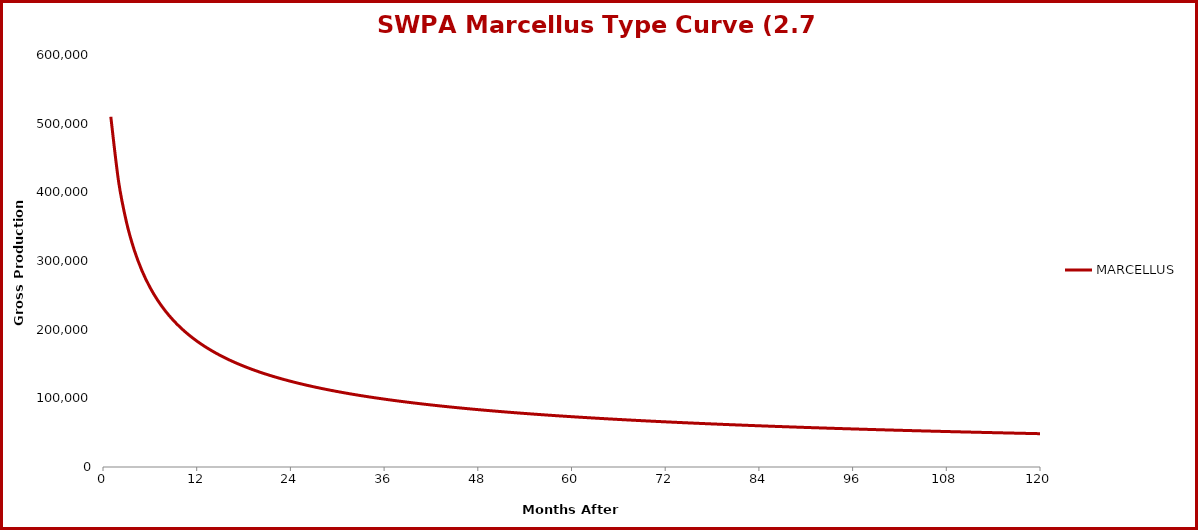
| Category | MARCELLUS |
|---|---|
| 1.0 | 510050 |
| 2.0 | 415552 |
| 3.0 | 356814 |
| 4.0 | 315990 |
| 5.0 | 285609 |
| 6.0 | 261923 |
| 7.0 | 242824 |
| 8.0 | 227023 |
| 9.0 | 213686 |
| 10.0 | 202243 |
| 11.0 | 192294 |
| 12.0 | 183544 |
| 13.0 | 175777 |
| 14.0 | 168824 |
| 15.0 | 162556 |
| 16.0 | 156869 |
| 17.0 | 151681 |
| 18.0 | 146924 |
| 19.0 | 142543 |
| 20.0 | 138492 |
| 21.0 | 134733 |
| 22.0 | 131232 |
| 23.0 | 127963 |
| 24.0 | 124901 |
| 25.0 | 122025 |
| 26.0 | 119319 |
| 27.0 | 116766 |
| 28.0 | 114353 |
| 29.0 | 112068 |
| 30.0 | 109900 |
| 31.0 | 107840 |
| 32.0 | 105879 |
| 33.0 | 104010 |
| 34.0 | 102226 |
| 35.0 | 100520 |
| 36.0 | 98888 |
| 37.0 | 97325 |
| 38.0 | 95825 |
| 39.0 | 94385 |
| 40.0 | 93001 |
| 41.0 | 91669 |
| 42.0 | 90387 |
| 43.0 | 89151 |
| 44.0 | 87959 |
| 45.0 | 86809 |
| 46.0 | 85697 |
| 47.0 | 84623 |
| 48.0 | 83583 |
| 49.0 | 82577 |
| 50.0 | 81602 |
| 51.0 | 80657 |
| 52.0 | 79740 |
| 53.0 | 78850 |
| 54.0 | 77987 |
| 55.0 | 77148 |
| 56.0 | 76332 |
| 57.0 | 75539 |
| 58.0 | 74767 |
| 59.0 | 74016 |
| 60.0 | 73285 |
| 61.0 | 72572 |
| 62.0 | 71878 |
| 63.0 | 71201 |
| 64.0 | 70540 |
| 65.0 | 69896 |
| 66.0 | 69267 |
| 67.0 | 68652 |
| 68.0 | 68052 |
| 69.0 | 67466 |
| 70.0 | 66893 |
| 71.0 | 66332 |
| 72.0 | 65784 |
| 73.0 | 65248 |
| 74.0 | 64723 |
| 75.0 | 64209 |
| 76.0 | 63705 |
| 77.0 | 63213 |
| 78.0 | 62730 |
| 79.0 | 62256 |
| 80.0 | 61793 |
| 81.0 | 61338 |
| 82.0 | 60892 |
| 83.0 | 60454 |
| 84.0 | 60025 |
| 85.0 | 59603 |
| 86.0 | 59190 |
| 87.0 | 58783 |
| 88.0 | 58385 |
| 89.0 | 57993 |
| 90.0 | 57608 |
| 91.0 | 57230 |
| 92.0 | 56858 |
| 93.0 | 56493 |
| 94.0 | 56134 |
| 95.0 | 55781 |
| 96.0 | 55433 |
| 97.0 | 55092 |
| 98.0 | 54756 |
| 99.0 | 54425 |
| 100.0 | 54099 |
| 101.0 | 53779 |
| 102.0 | 53464 |
| 103.0 | 53153 |
| 104.0 | 52847 |
| 105.0 | 52546 |
| 106.0 | 52249 |
| 107.0 | 51957 |
| 108.0 | 51669 |
| 109.0 | 51385 |
| 110.0 | 51105 |
| 111.0 | 50830 |
| 112.0 | 50558 |
| 113.0 | 50290 |
| 114.0 | 50026 |
| 115.0 | 49765 |
| 116.0 | 49508 |
| 117.0 | 49254 |
| 118.0 | 49004 |
| 119.0 | 48757 |
| 120.0 | 48514 |
| 121.0 | 48274 |
| 122.0 | 48036 |
| 123.0 | 47802 |
| 124.0 | 47571 |
| 125.0 | 47343 |
| 126.0 | 47117 |
| 127.0 | 46895 |
| 128.0 | 46675 |
| 129.0 | 46458 |
| 130.0 | 46244 |
| 131.0 | 46032 |
| 132.0 | 45823 |
| 133.0 | 45616 |
| 134.0 | 45412 |
| 135.0 | 45210 |
| 136.0 | 45010 |
| 137.0 | 44813 |
| 138.0 | 44618 |
| 139.0 | 44426 |
| 140.0 | 44235 |
| 141.0 | 44046 |
| 142.0 | 43858 |
| 143.0 | 43671 |
| 144.0 | 43485 |
| 145.0 | 43300 |
| 146.0 | 43115 |
| 147.0 | 42931 |
| 148.0 | 42748 |
| 149.0 | 42566 |
| 150.0 | 42384 |
| 151.0 | 42203 |
| 152.0 | 42023 |
| 153.0 | 41844 |
| 154.0 | 41665 |
| 155.0 | 41488 |
| 156.0 | 41311 |
| 157.0 | 41135 |
| 158.0 | 40959 |
| 159.0 | 40784 |
| 160.0 | 40610 |
| 161.0 | 40437 |
| 162.0 | 40265 |
| 163.0 | 40093 |
| 164.0 | 39922 |
| 165.0 | 39752 |
| 166.0 | 39582 |
| 167.0 | 39413 |
| 168.0 | 39245 |
| 169.0 | 39078 |
| 170.0 | 38911 |
| 171.0 | 38745 |
| 172.0 | 38580 |
| 173.0 | 38415 |
| 174.0 | 38252 |
| 175.0 | 38088 |
| 176.0 | 37926 |
| 177.0 | 37764 |
| 178.0 | 37603 |
| 179.0 | 37443 |
| 180.0 | 37283 |
| 181.0 | 37124 |
| 182.0 | 36966 |
| 183.0 | 36808 |
| 184.0 | 36651 |
| 185.0 | 36495 |
| 186.0 | 36339 |
| 187.0 | 36184 |
| 188.0 | 36030 |
| 189.0 | 35876 |
| 190.0 | 35723 |
| 191.0 | 35571 |
| 192.0 | 35419 |
| 193.0 | 35268 |
| 194.0 | 35117 |
| 195.0 | 34968 |
| 196.0 | 34818 |
| 197.0 | 34670 |
| 198.0 | 34522 |
| 199.0 | 34375 |
| 200.0 | 34228 |
| 201.0 | 34082 |
| 202.0 | 33937 |
| 203.0 | 33792 |
| 204.0 | 33648 |
| 205.0 | 33504 |
| 206.0 | 33361 |
| 207.0 | 33219 |
| 208.0 | 33077 |
| 209.0 | 32936 |
| 210.0 | 32796 |
| 211.0 | 32656 |
| 212.0 | 32517 |
| 213.0 | 32378 |
| 214.0 | 32240 |
| 215.0 | 32102 |
| 216.0 | 31966 |
| 217.0 | 31829 |
| 218.0 | 31693 |
| 219.0 | 31558 |
| 220.0 | 31424 |
| 221.0 | 31290 |
| 222.0 | 31156 |
| 223.0 | 31023 |
| 224.0 | 30891 |
| 225.0 | 30759 |
| 226.0 | 30628 |
| 227.0 | 30497 |
| 228.0 | 30367 |
| 229.0 | 30238 |
| 230.0 | 30109 |
| 231.0 | 29980 |
| 232.0 | 29852 |
| 233.0 | 29725 |
| 234.0 | 29598 |
| 235.0 | 29472 |
| 236.0 | 29346 |
| 237.0 | 29221 |
| 238.0 | 29097 |
| 239.0 | 28972 |
| 240.0 | 28849 |
| 241.0 | 28726 |
| 242.0 | 28603 |
| 243.0 | 28481 |
| 244.0 | 28360 |
| 245.0 | 28239 |
| 246.0 | 28118 |
| 247.0 | 27998 |
| 248.0 | 27879 |
| 249.0 | 27760 |
| 250.0 | 27642 |
| 251.0 | 27524 |
| 252.0 | 27406 |
| 253.0 | 27290 |
| 254.0 | 27173 |
| 255.0 | 27057 |
| 256.0 | 26942 |
| 257.0 | 26827 |
| 258.0 | 26712 |
| 259.0 | 26599 |
| 260.0 | 26485 |
| 261.0 | 26372 |
| 262.0 | 26260 |
| 263.0 | 26148 |
| 264.0 | 26036 |
| 265.0 | 25925 |
| 266.0 | 25814 |
| 267.0 | 25704 |
| 268.0 | 25595 |
| 269.0 | 25486 |
| 270.0 | 25377 |
| 271.0 | 25269 |
| 272.0 | 25161 |
| 273.0 | 25054 |
| 274.0 | 24947 |
| 275.0 | 24840 |
| 276.0 | 24734 |
| 277.0 | 24629 |
| 278.0 | 24524 |
| 279.0 | 24419 |
| 280.0 | 24315 |
| 281.0 | 24211 |
| 282.0 | 24108 |
| 283.0 | 24005 |
| 284.0 | 23903 |
| 285.0 | 23801 |
| 286.0 | 23699 |
| 287.0 | 23598 |
| 288.0 | 23498 |
| 289.0 | 23397 |
| 290.0 | 23298 |
| 291.0 | 23198 |
| 292.0 | 23099 |
| 293.0 | 23001 |
| 294.0 | 22903 |
| 295.0 | 22805 |
| 296.0 | 22708 |
| 297.0 | 22611 |
| 298.0 | 22514 |
| 299.0 | 22418 |
| 300.0 | 22323 |
| 301.0 | 22228 |
| 302.0 | 22133 |
| 303.0 | 22038 |
| 304.0 | 21944 |
| 305.0 | 21851 |
| 306.0 | 21757 |
| 307.0 | 21665 |
| 308.0 | 21572 |
| 309.0 | 21480 |
| 310.0 | 21389 |
| 311.0 | 21297 |
| 312.0 | 21207 |
| 313.0 | 21116 |
| 314.0 | 21026 |
| 315.0 | 20936 |
| 316.0 | 20847 |
| 317.0 | 20758 |
| 318.0 | 20670 |
| 319.0 | 20581 |
| 320.0 | 20494 |
| 321.0 | 20406 |
| 322.0 | 20319 |
| 323.0 | 20233 |
| 324.0 | 20146 |
| 325.0 | 20060 |
| 326.0 | 19975 |
| 327.0 | 19890 |
| 328.0 | 19805 |
| 329.0 | 19720 |
| 330.0 | 19636 |
| 331.0 | 19552 |
| 332.0 | 19469 |
| 333.0 | 19386 |
| 334.0 | 19303 |
| 335.0 | 19221 |
| 336.0 | 19139 |
| 337.0 | 19057 |
| 338.0 | 18976 |
| 339.0 | 18895 |
| 340.0 | 18814 |
| 341.0 | 18734 |
| 342.0 | 18654 |
| 343.0 | 18575 |
| 344.0 | 18496 |
| 345.0 | 18417 |
| 346.0 | 18338 |
| 347.0 | 18260 |
| 348.0 | 18182 |
| 349.0 | 18104 |
| 350.0 | 18027 |
| 351.0 | 17950 |
| 352.0 | 17874 |
| 353.0 | 17798 |
| 354.0 | 17722 |
| 355.0 | 17646 |
| 356.0 | 17571 |
| 357.0 | 17496 |
| 358.0 | 17421 |
| 359.0 | 17347 |
| 360.0 | 17273 |
| 361.0 | 17199 |
| 362.0 | 17126 |
| 363.0 | 17053 |
| 364.0 | 16980 |
| 365.0 | 16908 |
| 366.0 | 16836 |
| 367.0 | 16764 |
| 368.0 | 16692 |
| 369.0 | 16621 |
| 370.0 | 16550 |
| 371.0 | 16480 |
| 372.0 | 16409 |
| 373.0 | 16339 |
| 374.0 | 16270 |
| 375.0 | 16200 |
| 376.0 | 16131 |
| 377.0 | 16062 |
| 378.0 | 15994 |
| 379.0 | 15926 |
| 380.0 | 15858 |
| 381.0 | 15790 |
| 382.0 | 15723 |
| 383.0 | 15656 |
| 384.0 | 15589 |
| 385.0 | 15522 |
| 386.0 | 15456 |
| 387.0 | 15390 |
| 388.0 | 15325 |
| 389.0 | 15259 |
| 390.0 | 15194 |
| 391.0 | 15129 |
| 392.0 | 15065 |
| 393.0 | 15000 |
| 394.0 | 14936 |
| 395.0 | 14873 |
| 396.0 | 14809 |
| 397.0 | 14746 |
| 398.0 | 14683 |
| 399.0 | 14621 |
| 400.0 | 14558 |
| 401.0 | 14496 |
| 402.0 | 14434 |
| 403.0 | 14373 |
| 404.0 | 14311 |
| 405.0 | 14250 |
| 406.0 | 14190 |
| 407.0 | 14129 |
| 408.0 | 14069 |
| 409.0 | 14009 |
| 410.0 | 13949 |
| 411.0 | 13890 |
| 412.0 | 13830 |
| 413.0 | 13771 |
| 414.0 | 13713 |
| 415.0 | 13654 |
| 416.0 | 13596 |
| 417.0 | 13538 |
| 418.0 | 13480 |
| 419.0 | 13423 |
| 420.0 | 13365 |
| 421.0 | 13308 |
| 422.0 | 13252 |
| 423.0 | 13195 |
| 424.0 | 13139 |
| 425.0 | 13083 |
| 426.0 | 13027 |
| 427.0 | 12971 |
| 428.0 | 12916 |
| 429.0 | 12861 |
| 430.0 | 12806 |
| 431.0 | 12752 |
| 432.0 | 12697 |
| 433.0 | 12643 |
| 434.0 | 12589 |
| 435.0 | 12535 |
| 436.0 | 12482 |
| 437.0 | 12429 |
| 438.0 | 12376 |
| 439.0 | 12323 |
| 440.0 | 12270 |
| 441.0 | 12218 |
| 442.0 | 12166 |
| 443.0 | 12114 |
| 444.0 | 12062 |
| 445.0 | 12011 |
| 446.0 | 11960 |
| 447.0 | 11909 |
| 448.0 | 11858 |
| 449.0 | 11807 |
| 450.0 | 11757 |
| 451.0 | 11707 |
| 452.0 | 11657 |
| 453.0 | 11607 |
| 454.0 | 11558 |
| 455.0 | 11508 |
| 456.0 | 11459 |
| 457.0 | 11410 |
| 458.0 | 11362 |
| 459.0 | 11313 |
| 460.0 | 11265 |
| 461.0 | 11217 |
| 462.0 | 11169 |
| 463.0 | 11121 |
| 464.0 | 11074 |
| 465.0 | 11027 |
| 466.0 | 10980 |
| 467.0 | 10933 |
| 468.0 | 10886 |
| 469.0 | 10840 |
| 470.0 | 10794 |
| 471.0 | 10748 |
| 472.0 | 10702 |
| 473.0 | 10656 |
| 474.0 | 10611 |
| 475.0 | 10565 |
| 476.0 | 10520 |
| 477.0 | 10475 |
| 478.0 | 10431 |
| 479.0 | 10386 |
| 480.0 | 10342 |
| 481.0 | 10298 |
| 482.0 | 10254 |
| 483.0 | 10210 |
| 484.0 | 10167 |
| 485.0 | 10123 |
| 486.0 | 10080 |
| 487.0 | 10037 |
| 488.0 | 9994 |
| 489.0 | 9952 |
| 490.0 | 9909 |
| 491.0 | 9867 |
| 492.0 | 9825 |
| 493.0 | 9783 |
| 494.0 | 9741 |
| 495.0 | 9700 |
| 496.0 | 9658 |
| 497.0 | 9617 |
| 498.0 | 9576 |
| 499.0 | 9535 |
| 500.0 | 9495 |
| 501.0 | 9454 |
| 502.0 | 9414 |
| 503.0 | 9374 |
| 504.0 | 9334 |
| 505.0 | 9294 |
| 506.0 | 9254 |
| 507.0 | 9215 |
| 508.0 | 9175 |
| 509.0 | 9136 |
| 510.0 | 9097 |
| 511.0 | 9058 |
| 512.0 | 9020 |
| 513.0 | 8981 |
| 514.0 | 8943 |
| 515.0 | 8905 |
| 516.0 | 8867 |
| 517.0 | 8829 |
| 518.0 | 8791 |
| 519.0 | 8754 |
| 520.0 | 8717 |
| 521.0 | 8679 |
| 522.0 | 8642 |
| 523.0 | 8606 |
| 524.0 | 8569 |
| 525.0 | 8532 |
| 526.0 | 8496 |
| 527.0 | 8460 |
| 528.0 | 8424 |
| 529.0 | 8388 |
| 530.0 | 8352 |
| 531.0 | 8316 |
| 532.0 | 8281 |
| 533.0 | 8245 |
| 534.0 | 8210 |
| 535.0 | 8175 |
| 536.0 | 8140 |
| 537.0 | 8106 |
| 538.0 | 8071 |
| 539.0 | 8037 |
| 540.0 | 8002 |
| 541.0 | 7968 |
| 542.0 | 7934 |
| 543.0 | 7900 |
| 544.0 | 7867 |
| 545.0 | 7833 |
| 546.0 | 7800 |
| 547.0 | 7766 |
| 548.0 | 7733 |
| 549.0 | 7700 |
| 550.0 | 7668 |
| 551.0 | 7635 |
| 552.0 | 7602 |
| 553.0 | 7570 |
| 554.0 | 7538 |
| 555.0 | 7505 |
| 556.0 | 7473 |
| 557.0 | 7442 |
| 558.0 | 7410 |
| 559.0 | 7378 |
| 560.0 | 7347 |
| 561.0 | 7315 |
| 562.0 | 7284 |
| 563.0 | 7253 |
| 564.0 | 7222 |
| 565.0 | 7191 |
| 566.0 | 7161 |
| 567.0 | 7130 |
| 568.0 | 7100 |
| 569.0 | 7069 |
| 570.0 | 7039 |
| 571.0 | 7009 |
| 572.0 | 6979 |
| 573.0 | 6950 |
| 574.0 | 6920 |
| 575.0 | 6890 |
| 576.0 | 6861 |
| 577.0 | 6832 |
| 578.0 | 6803 |
| 579.0 | 6774 |
| 580.0 | 6745 |
| 581.0 | 6716 |
| 582.0 | 6687 |
| 583.0 | 6659 |
| 584.0 | 6630 |
| 585.0 | 6602 |
| 586.0 | 6574 |
| 587.0 | 6546 |
| 588.0 | 6518 |
| 589.0 | 6490 |
| 590.0 | 6463 |
| 591.0 | 6435 |
| 592.0 | 6407 |
| 593.0 | 6380 |
| 594.0 | 6353 |
| 595.0 | 6326 |
| 596.0 | 6299 |
| 597.0 | 6272 |
| 598.0 | 6245 |
| 599.0 | 6219 |
| 600.0 | 6192 |
| 601.0 | 6166 |
| 602.0 | 6139 |
| 603.0 | 6113 |
| 604.0 | 6087 |
| 605.0 | 6061 |
| 606.0 | 6035 |
| 607.0 | 6010 |
| 608.0 | 5984 |
| 609.0 | 5958 |
| 610.0 | 5933 |
| 611.0 | 5908 |
| 612.0 | 5882 |
| 613.0 | 5857 |
| 614.0 | 5832 |
| 615.0 | 5808 |
| 616.0 | 5783 |
| 617.0 | 5758 |
| 618.0 | 5734 |
| 619.0 | 5709 |
| 620.0 | 5685 |
| 621.0 | 5660 |
| 622.0 | 5636 |
| 623.0 | 5612 |
| 624.0 | 5588 |
| 625.0 | 5565 |
| 626.0 | 5541 |
| 627.0 | 5517 |
| 628.0 | 5494 |
| 629.0 | 5470 |
| 630.0 | 5447 |
| 631.0 | 5424 |
| 632.0 | 5400 |
| 633.0 | 5377 |
| 634.0 | 5355 |
| 635.0 | 5332 |
| 636.0 | 5309 |
| 637.0 | 5286 |
| 638.0 | 5264 |
| 639.0 | 5241 |
| 640.0 | 5219 |
| 641.0 | 5197 |
| 642.0 | 5175 |
| 643.0 | 5152 |
| 644.0 | 5130 |
| 645.0 | 5109 |
| 646.0 | 5087 |
| 647.0 | 5065 |
| 648.0 | 5044 |
| 649.0 | 5022 |
| 650.0 | 5001 |
| 651.0 | 4979 |
| 652.0 | 4958 |
| 653.0 | 4937 |
| 654.0 | 4916 |
| 655.0 | 4895 |
| 656.0 | 4874 |
| 657.0 | 4853 |
| 658.0 | 4832 |
| 659.0 | 4812 |
| 660.0 | 4791 |
| 661.0 | 4771 |
| 662.0 | 4751 |
| 663.0 | 4730 |
| 664.0 | 4710 |
| 665.0 | 4690 |
| 666.0 | 4670 |
| 667.0 | 4650 |
| 668.0 | 4630 |
| 669.0 | 4611 |
| 670.0 | 4591 |
| 671.0 | 4571 |
| 672.0 | 4552 |
| 673.0 | 4532 |
| 674.0 | 4513 |
| 675.0 | 4494 |
| 676.0 | 4475 |
| 677.0 | 4456 |
| 678.0 | 4437 |
| 679.0 | 4418 |
| 680.0 | 4399 |
| 681.0 | 4380 |
| 682.0 | 4361 |
| 683.0 | 4343 |
| 684.0 | 4324 |
| 685.0 | 4306 |
| 686.0 | 4287 |
| 687.0 | 4269 |
| 688.0 | 4251 |
| 689.0 | 4233 |
| 690.0 | 4215 |
| 691.0 | 4197 |
| 692.0 | 4179 |
| 693.0 | 4161 |
| 694.0 | 4143 |
| 695.0 | 4126 |
| 696.0 | 4108 |
| 697.0 | 4090 |
| 698.0 | 4073 |
| 699.0 | 4056 |
| 700.0 | 4038 |
| 701.0 | 4021 |
| 702.0 | 4004 |
| 703.0 | 3987 |
| 704.0 | 3970 |
| 705.0 | 3953 |
| 706.0 | 3936 |
| 707.0 | 3919 |
| 708.0 | 3903 |
| 709.0 | 3886 |
| 710.0 | 3869 |
| 711.0 | 3853 |
| 712.0 | 3836 |
| 713.0 | 3820 |
| 714.0 | 3804 |
| 715.0 | 3788 |
| 716.0 | 3771 |
| 717.0 | 3755 |
| 718.0 | 3739 |
| 719.0 | 3723 |
| 720.0 | 3707 |
| 721.0 | 3692 |
| 722.0 | 3676 |
| 723.0 | 3660 |
| 724.0 | 3645 |
| 725.0 | 3629 |
| 726.0 | 3614 |
| 727.0 | 3598 |
| 728.0 | 3583 |
| 729.0 | 3568 |
| 730.0 | 3552 |
| 731.0 | 3537 |
| 732.0 | 3522 |
| 733.0 | 3507 |
| 734.0 | 3492 |
| 735.0 | 3477 |
| 736.0 | 3462 |
| 737.0 | 3448 |
| 738.0 | 3433 |
| 739.0 | 3418 |
| 740.0 | 3404 |
| 741.0 | 3389 |
| 742.0 | 3375 |
| 743.0 | 3360 |
| 744.0 | 3346 |
| 745.0 | 3332 |
| 746.0 | 3317 |
| 747.0 | 3303 |
| 748.0 | 3289 |
| 749.0 | 3275 |
| 750.0 | 3261 |
| 751.0 | 3247 |
| 752.0 | 3233 |
| 753.0 | 3220 |
| 754.0 | 3206 |
| 755.0 | 3192 |
| 756.0 | 3179 |
| 757.0 | 3165 |
| 758.0 | 3152 |
| 759.0 | 3138 |
| 760.0 | 3125 |
| 761.0 | 3111 |
| 762.0 | 3098 |
| 763.0 | 3085 |
| 764.0 | 3072 |
| 765.0 | 3059 |
| 766.0 | 3046 |
| 767.0 | 3033 |
| 768.0 | 3020 |
| 769.0 | 3007 |
| 770.0 | 2994 |
| 771.0 | 2981 |
| 772.0 | 2969 |
| 773.0 | 2956 |
| 774.0 | 2943 |
| 775.0 | 2931 |
| 776.0 | 2918 |
| 777.0 | 2906 |
| 778.0 | 2893 |
| 779.0 | 2881 |
| 780.0 | 2869 |